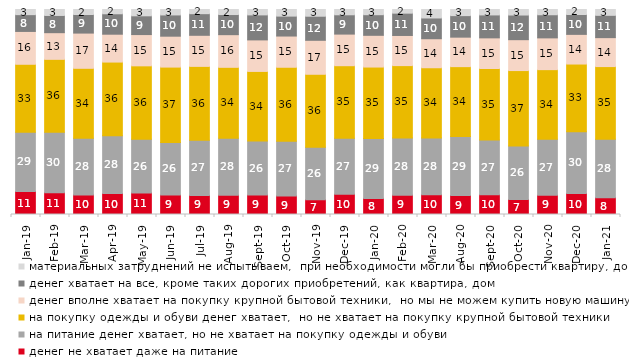
| Category | денег не хватает даже на питание | на питание денег хватает, но не хватает на покупку одежды и обуви | на покупку одежды и обуви денег хватает,  но не хватает на покупку крупной бытовой техники | денег вполне хватает на покупку крупной бытовой техники,  но мы не можем купить новую машину | денег хватает на все, кроме таких дорогих приобретений, как квартира, дом | материальных затруднений не испытываем,  при необходимости могли бы приобрести квартиру, дом |
|---|---|---|---|---|---|---|
| 2019-01-01 | 11.15 | 28.75 | 33.05 | 15.95 | 8.15 | 2.5 |
| 2019-02-01 | 10.6 | 29.5 | 35.55 | 13 | 8.4 | 2.9 |
| 2019-03-01 | 9.547 | 27.648 | 34.013 | 17.156 | 9.05 | 2.437 |
| 2019-04-01 | 10.198 | 28.119 | 35.891 | 13.564 | 9.95 | 2.079 |
| 2019-05-01 | 10.5 | 26.053 | 35.711 | 15.206 | 9.113 | 3.071 |
| 2019-06-01 | 9.426 | 25.536 | 36.658 | 15.012 | 10.324 | 2.643 |
| 2019-07-01 | 9.307 | 26.931 | 35.941 | 15.149 | 10.545 | 2.03 |
| 2019-08-01 | 9.391 | 27.722 | 34.466 | 15.884 | 9.79 | 2.448 |
| 2019-09-01 | 9.455 | 26.337 | 33.861 | 15.347 | 12.178 | 2.624 |
| 2019-10-01 | 9.059 | 26.584 | 36.04 | 15.198 | 9.703 | 3.218 |
| 2019-11-01 | 7.178 | 25.545 | 35.545 | 16.535 | 11.733 | 3.267 |
| 2019-12-01 | 9.851 | 27.327 | 35.297 | 15.396 | 9.406 | 2.574 |
| 2020-01-01 | 7.822 | 29.109 | 34.604 | 15.396 | 10 | 2.525 |
| 2020-02-01 | 9.406 | 27.772 | 35.198 | 14.653 | 10.842 | 1.782 |
| 2020-03-01 | 9.569 | 27.566 | 34.06 | 14.08 | 10.064 | 4.115 |
| 2020-08-01 | 9.235 | 28.699 | 34.012 | 14.35 | 10.477 | 2.979 |
| 2020-09-01 | 9.557 | 26.68 | 34.744 | 14.883 | 11.15 | 2.638 |
| 2020-10-01 | 7.275 | 26.109 | 36.721 | 15.047 | 12.008 | 2.691 |
| 2020-11-01 | 9.35 | 27.25 | 33.85 | 15.45 | 11.25 | 2.55 |
| 2020-12-01 | 10.213 | 29.995 | 32.97 | 14.427 | 9.668 | 2.429 |
| 2021-01-01 | 8.147 | 28.366 | 35.32 | 14.059 | 10.83 | 2.832 |